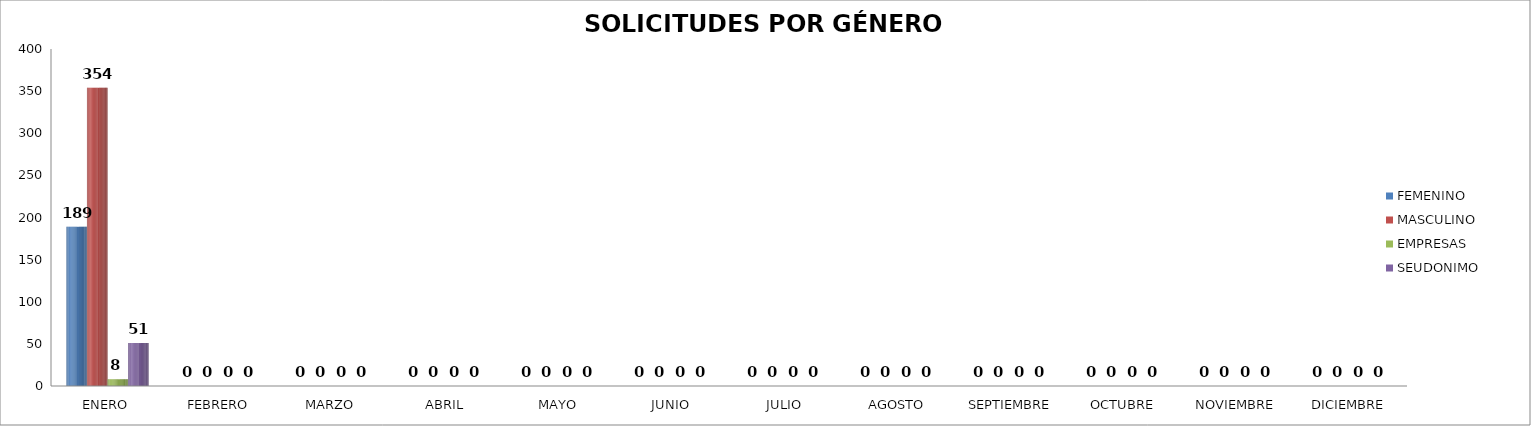
| Category | FEMENINO | MASCULINO | EMPRESAS | SEUDONIMO |
|---|---|---|---|---|
| ENERO | 189 | 354 | 8 | 51 |
| FEBRERO | 0 | 0 | 0 | 0 |
| MARZO  | 0 | 0 | 0 | 0 |
| ABRIL | 0 | 0 | 0 | 0 |
| MAYO | 0 | 0 | 0 | 0 |
| JUNIO | 0 | 0 | 0 | 0 |
| JULIO | 0 | 0 | 0 | 0 |
| AGOSTO | 0 | 0 | 0 | 0 |
| SEPTIEMBRE | 0 | 0 | 0 | 0 |
| OCTUBRE | 0 | 0 | 0 | 0 |
| NOVIEMBRE | 0 | 0 | 0 | 0 |
| DICIEMBRE | 0 | 0 | 0 | 0 |